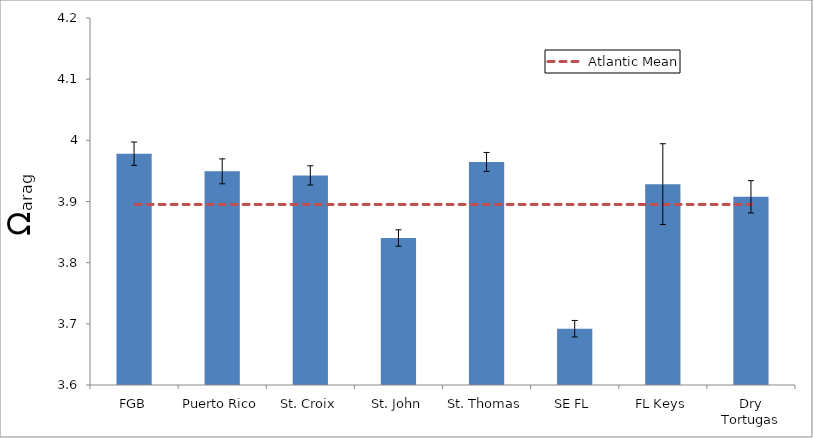
| Category | Series 0 |
|---|---|
| FGB | 3.978 |
| Puerto Rico | 3.949 |
| St. Croix | 3.943 |
| St. John | 3.84 |
| St. Thomas | 3.965 |
| SE FL | 3.692 |
| FL Keys | 3.928 |
| Dry Tortugas | 3.908 |